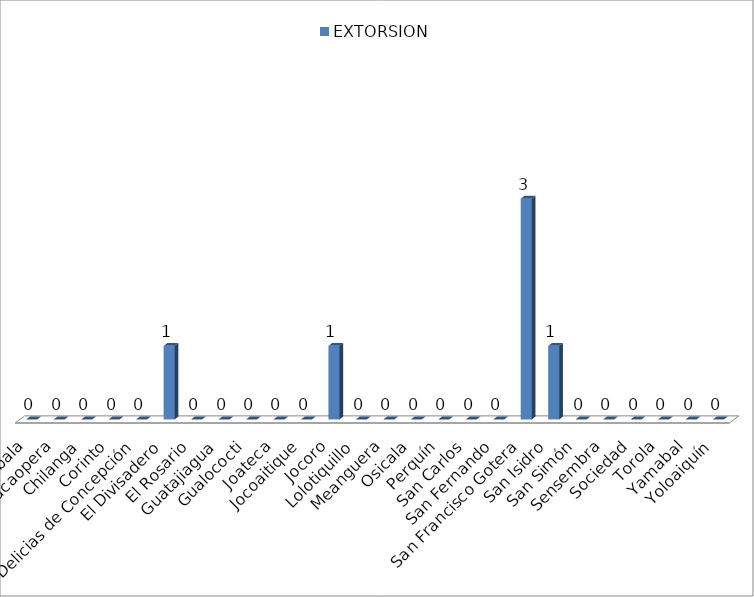
| Category | EXTORSION |
|---|---|
| Arambala | 0 |
| Cacaopera | 0 |
| Chilanga | 0 |
| Corinto | 0 |
| Delicias de Concepción | 0 |
| El Divisadero | 1 |
| El Rosario | 0 |
| Guatajiagua | 0 |
| Gualococti | 0 |
| Joateca | 0 |
| Jocoaitique | 0 |
| Jocoro | 1 |
| Lolotiquillo | 0 |
| Meanguera | 0 |
| Osicala | 0 |
| Perquín | 0 |
| San Carlos | 0 |
| San Fernando | 0 |
| San Francisco Gotera | 3 |
| San Isidro | 1 |
| San Simón | 0 |
| Sensembra | 0 |
| Sociedad | 0 |
| Torola | 0 |
| Yamabal | 0 |
| Yoloaiquín | 0 |